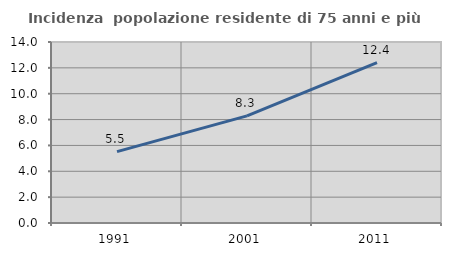
| Category | Incidenza  popolazione residente di 75 anni e più |
|---|---|
| 1991.0 | 5.518 |
| 2001.0 | 8.283 |
| 2011.0 | 12.402 |